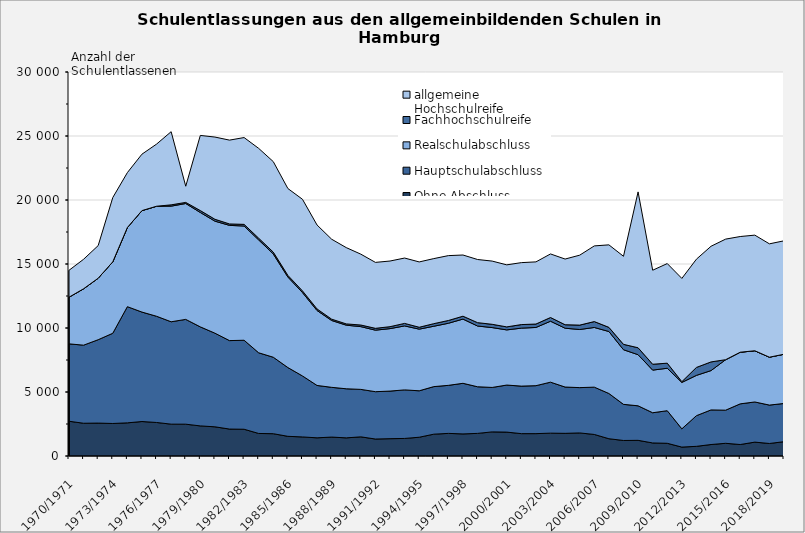
| Category | Ohne Abschluss | Hauptschulabschluss | Realschulabschluss | Fachhochschulreife | allgemeine Hochschulreife |
|---|---|---|---|---|---|
| 1970/1971 | 2715 | 6046 | 3646 | 0 | 2101 |
| 1971/1972 | 2559 | 6100 | 4406 | 0 | 2304 |
| 1972/1973 | 2572 | 6513 | 4805 | 0 | 2548 |
| 1973/1974 | 2541 | 7047 | 5581 | 0 | 5021 |
| 1974/1975 | 2590 | 9077 | 6184 | 0 | 4288 |
| 1975/1976 | 2693 | 8551 | 7928 | 0 | 4409 |
| 1976/1977 | 2619 | 8298 | 8594 | 3 | 4852 |
| 1977/1978 | 2488 | 7998 | 9034 | 101 | 5716 |
| 1978/1979 | 2486 | 8187 | 9053 | 87 | 1263 |
| 1979/1980 | 2352 | 7736 | 8937 | 149 | 5870 |
| 1980/1981 | 2281 | 7316 | 8751 | 148 | 6421 |
| 1981/1982 | 2105 | 6911 | 9002 | 111 | 6549 |
| 1982/1983 | 2091 | 6953 | 8923 | 129 | 6782 |
| 1983/1984 | 1761 | 6302 | 8816 | 137 | 7016 |
| 1984/1985 | 1743 | 5974 | 8067 | 144 | 7069 |
| 1985/1986 | 1537 | 5373 | 7072 | 128 | 6786 |
| 1986/1987 | 1490 | 4764 | 6514 | 132 | 7155 |
| 1987/1988 | 1420 | 4092 | 5855 | 122 | 6557 |
| 1988/1989 | 1479 | 3885 | 5224 | 103 | 6246 |
| 1989/1990 | 1417 | 3835 | 4969 | 99 | 5961 |
| 1990/1991 | 1497 | 3708 | 4902 | 126 | 5536 |
| 1991/1992 | 1326 | 3699 | 4806 | 143 | 5152 |
| 1992/1993 | 1353 | 3718 | 4881 | 151 | 5130 |
| 1993/1994 | 1371 | 3795 | 4997 | 197 | 5106 |
| 1994/1995 | 1467 | 3627 | 4818 | 146 | 5104 |
| 1995/1996 | 1705 | 3716 | 4716 | 202 | 5083 |
| 1996/1997 | 1767 | 3752 | 4852 | 216 | 5068 |
| 1997/1998 | 1725 | 3954 | 5017 | 226 | 4780 |
| 1998/1999 | 1767 | 3642 | 4746 | 263 | 4933 |
| 1999/2000 | 1884 | 3472 | 4677 | 256 | 4939 |
| 2000/2001 | 1867 | 3676 | 4309 | 235 | 4846 |
| 2001/2002 | 1747 | 3713 | 4530 | 277 | 4840 |
| 2002/2003 | 1747 | 3747 | 4548 | 268 | 4856 |
| 2003/2004 | 1785 | 3983 | 4761 | 291 | 4965 |
| 2004/2005 | 1771 | 3616 | 4597 | 272 | 5132 |
| 2005/2006 | 1802 | 3541 | 4539 | 343 | 5465 |
| 2006/2007 | 1684 | 3695 | 4663 | 460 | 5912 |
| 2007/2008 | 1349 | 3536 | 4841 | 325 | 6445 |
| 2008/2009 | 1213 | 2822 | 4269 | 420 | 6879 |
| 2009/2010 | 1224 | 2698 | 3993 | 542 | 12176 |
| 2010/2011 | 1020 | 2359 | 3330 | 460 | 7345 |
| 2011/2012 | 993 | 2546 | 3317 | 395 | 7783 |
| 2012/2013 | 697 | 1425 | 3625 | 61 | 8066 |
| 2013/2014 | 755 | 2396 | 3149 | 620 | 8459 |
| 2014/2015 | 897 | 2703 | 3073 | 677 | 9036 |
| 2015/2016 | 992 | 2588 | 3944 | 0 | 9420 |
| 2016/2017 | 896 | 3178 | 4034 | 0 | 9038 |
| 2017/2018 | 1084 | 3138 | 4001 | 0 | 9032 |
| 2018/2019 | 978 | 3000 | 3742 | 0 | 8855 |
| 2019/2020 | 1119 | 2986 | 3846 | 0 | 8860 |